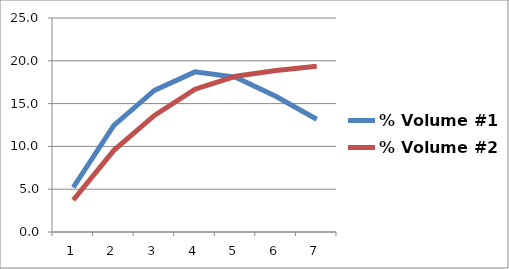
| Category | % Volume #1 | % Volume #2 |
|---|---|---|
| 1.0 | 5.213 | 3.734 |
| 2.0 | 12.466 | 9.537 |
| 3.0 | 16.538 | 13.623 |
| 4.0 | 18.707 | 16.684 |
| 5.0 | 18.079 | 18.189 |
| 6.0 | 15.823 | 18.863 |
| 7.0 | 13.174 | 19.37 |